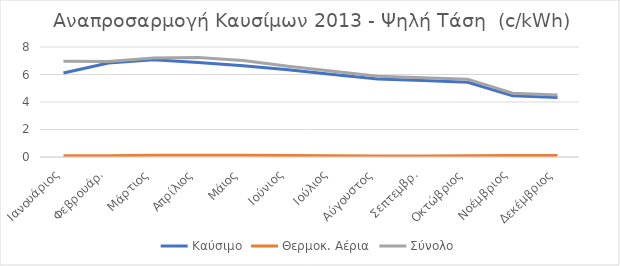
| Category | Καύσιμο | Θερμοκ. Αέρια | Σύνολο |
|---|---|---|---|
| Ιανουάριος | 6.108 | 0.093 | 6.972 |
| Φεβρουάρ. | 6.834 | 0.098 | 6.94 |
| Μάρτιος | 7.081 | 0.12 | 7.208 |
| Απρίλιος | 6.873 | 0.12 | 7.234 |
| Μάιος | 6.645 | 0.124 | 7.019 |
| Ιούνιος | 6.344 | 0.104 | 6.6 |
| Ιούλιος | 6 | 0.094 | 6.233 |
| Αύγουστος | 5.672 | 0.075 | 5.873 |
| Σεπτεμβρ. | 5.566 | 0.074 | 5.763 |
| Οκτώβριος | 5.441 | 0.092 | 5.649 |
| Νοέμβριος | 4.459 | 0.104 | 4.64 |
| Δεκέμβριος | 4.32 | 0.112 | 4.503 |